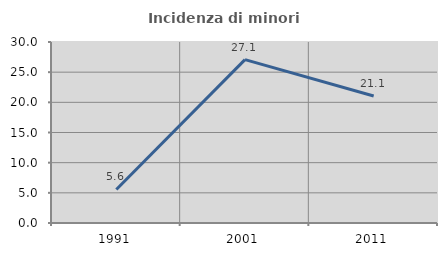
| Category | Incidenza di minori stranieri |
|---|---|
| 1991.0 | 5.556 |
| 2001.0 | 27.083 |
| 2011.0 | 21.053 |